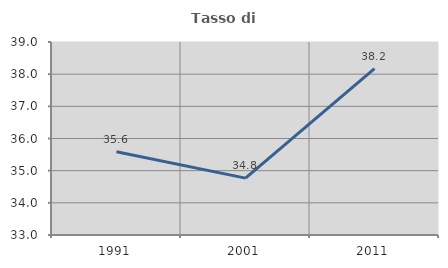
| Category | Tasso di occupazione   |
|---|---|
| 1991.0 | 35.586 |
| 2001.0 | 34.768 |
| 2011.0 | 38.174 |